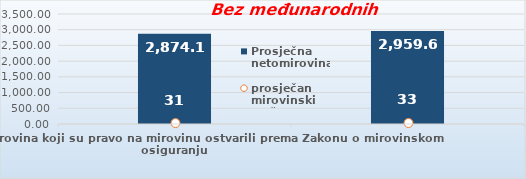
| Category | Prosječna netomirovina  |
|---|---|
| Korisnici mirovina koji su pravo na mirovinu ostvarili prema Zakonu o mirovinskom osiguranju  | 2874.11 |
| Korisnici koji su pravo na mirovinu PRVI PUT ostvarili u 2020. godini prema Zakonu o mirovinskom osiguranju - NOVI KORISNICI | 2959.67 |